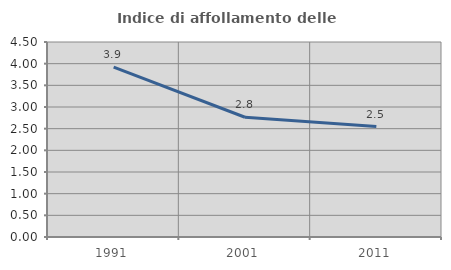
| Category | Indice di affollamento delle abitazioni  |
|---|---|
| 1991.0 | 3.922 |
| 2001.0 | 2.764 |
| 2011.0 | 2.548 |